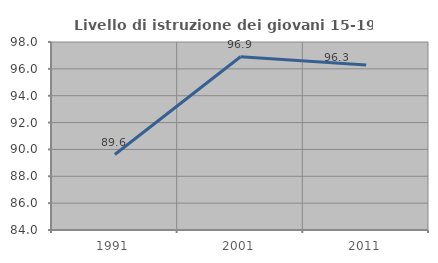
| Category | Livello di istruzione dei giovani 15-19 anni |
|---|---|
| 1991.0 | 89.622 |
| 2001.0 | 96.905 |
| 2011.0 | 96.292 |